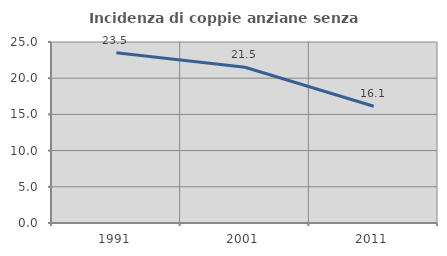
| Category | Incidenza di coppie anziane senza figli  |
|---|---|
| 1991.0 | 23.529 |
| 2001.0 | 21.519 |
| 2011.0 | 16.129 |